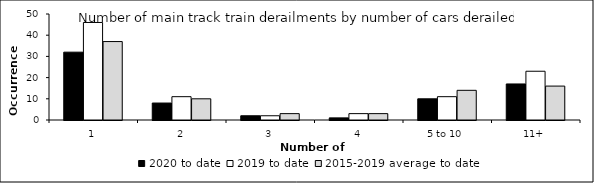
| Category | 2020 to date | 2019 to date | 2015-2019 average to date |
|---|---|---|---|
| 1 | 32 | 46 | 37 |
| 2 | 8 | 11 | 10 |
| 3 | 2 | 2 | 3 |
| 4 | 1 | 3 | 3 |
| 5 to 10 | 10 | 11 | 14 |
| 11+ | 17 | 23 | 16 |